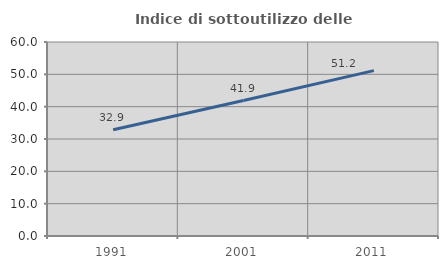
| Category | Indice di sottoutilizzo delle abitazioni  |
|---|---|
| 1991.0 | 32.882 |
| 2001.0 | 41.903 |
| 2011.0 | 51.153 |